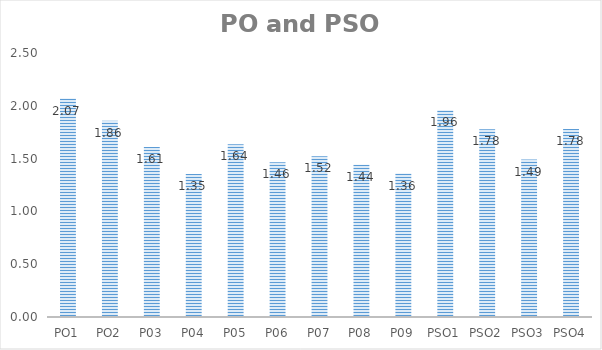
| Category | Series 0 |
|---|---|
| PO1 | 2.069 |
| PO2 | 1.859 |
| P03 | 1.609 |
| P04 | 1.353 |
| P05 | 1.637 |
| P06 | 1.464 |
| P07 | 1.521 |
| P08 | 1.443 |
| P09 | 1.359 |
| PSO1 | 1.957 |
| PSO2 | 1.777 |
| PSO3 | 1.491 |
| PSO4 | 1.781 |